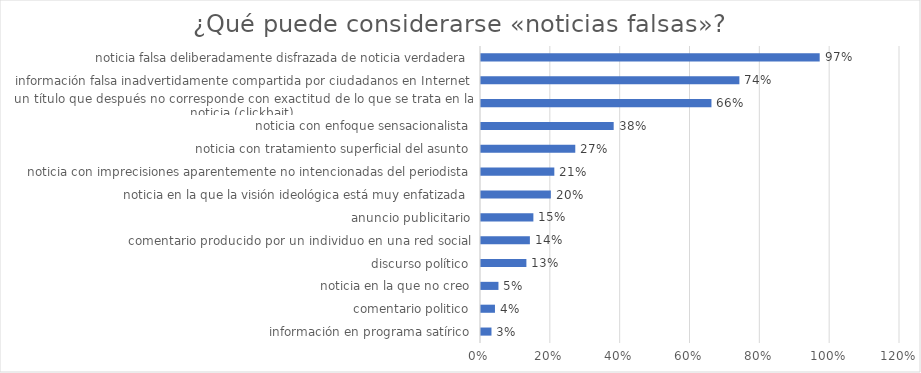
| Category | Series 0 |
|---|---|
| noticia falsa deliberadamente disfrazada de noticia verdadera | 0.97 |
| información falsa inadvertidamente compartida por ciudadanos en Internet | 0.74 |
| un título que después no corresponde con exactitud de lo que se trata en la noticia (clickbait) | 0.66 |
| noticia con enfoque sensacionalista | 0.38 |
| noticia con tratamiento superficial del asunto | 0.27 |
| noticia con imprecisiones aparentemente no intencionadas del periodista | 0.21 |
| noticia en la que la visión ideológica está muy enfatizada | 0.2 |
| anuncio publicitario | 0.15 |
| comentario producido por un individuo en una red social | 0.14 |
| discurso político | 0.13 |
| noticia en la que no creo | 0.05 |
| comentario politico | 0.04 |
| información en programa satírico | 0.03 |